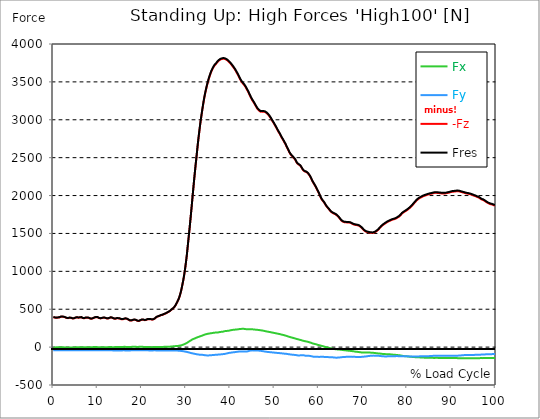
| Category |  Fx |  Fy |  -Fz |  Fres |
|---|---|---|---|---|
| 0.0 | -3.772 | -42.197 | 394.837 | 397.317 |
| 0.167348456675344 | -4.09 | -42.43 | 393.46 | 395.961 |
| 0.334696913350688 | -4.387 | -42.514 | 389.603 | 392.146 |
| 0.5020453700260321 | -3.942 | -42.154 | 386.911 | 389.433 |
| 0.669393826701376 | -3.264 | -41.688 | 386.636 | 389.094 |
| 0.83674228337672 | -2.798 | -41.243 | 388.564 | 390.959 |
| 1.0040907400520642 | -2.904 | -40.904 | 389.687 | 392.019 |
| 1.1621420602454444 | -2.84 | -40.459 | 389.009 | 391.277 |
| 1.3294905169207885 | -2.289 | -40.141 | 391.446 | 393.651 |
| 1.4968389735961325 | -1.886 | -40.141 | 395.791 | 397.932 |
| 1.6641874302714765 | -1.632 | -40.353 | 400.517 | 402.637 |
| 1.8315358869468206 | -1.95 | -40.48 | 402.043 | 404.184 |
| 1.9988843436221646 | -2.374 | -40.649 | 401.513 | 403.696 |
| 2.1662328002975086 | -2.395 | -40.734 | 399.966 | 402.149 |
| 2.333581256972853 | -2.522 | -40.861 | 399.585 | 401.81 |
| 2.5009297136481967 | -3.2 | -40.967 | 397.614 | 399.86 |
| 2.6682781703235405 | -4.281 | -41.031 | 392.994 | 395.304 |
| 2.8356266269988843 | -5.129 | -40.988 | 387.95 | 390.302 |
| 3.002975083674229 | -5.532 | -41.01 | 384.262 | 386.657 |
| 3.1703235403495724 | -5.341 | -40.904 | 382.227 | 384.664 |
| 3.337671997024917 | -5.171 | -40.84 | 382.164 | 384.601 |
| 3.4957233172182973 | -5.171 | -40.988 | 385.025 | 387.462 |
| 3.663071773893641 | -5.214 | -41.2 | 387.61 | 390.048 |
| 3.8304202305689854 | -5.616 | -41.349 | 387.738 | 390.175 |
| 3.997768687244329 | -6.019 | -41.349 | 385.427 | 387.886 |
| 4.165117143919673 | -6.443 | -41.306 | 381.697 | 384.156 |
| 4.332465600595017 | -6.316 | -41.031 | 378.497 | 380.956 |
| 4.499814057270361 | -5.722 | -40.565 | 377.247 | 379.642 |
| 4.667162513945706 | -4.535 | -40.077 | 379.514 | 381.782 |
| 4.834510970621049 | -3.221 | -39.844 | 383.796 | 385.979 |
| 5.001859427296393 | -2.649 | -40.162 | 388.501 | 390.683 |
| 5.169207883971737 | -2.437 | -40.416 | 392.019 | 394.202 |
| 5.336556340647081 | -2.67 | -40.565 | 392.888 | 395.092 |
| 5.503904797322425 | -2.861 | -40.713 | 391.15 | 393.396 |
| 5.671253253997769 | -2.904 | -40.861 | 388.289 | 390.578 |
| 5.82930457419115 | -2.183 | -40.734 | 387.907 | 390.175 |
| 5.996653030866494 | -1.335 | -40.522 | 391.552 | 393.778 |
| 6.164001487541838 | -0.911 | -40.416 | 394.943 | 397.148 |
| 6.331349944217181 | -1.526 | -40.48 | 393.947 | 396.151 |
| 6.498698400892526 | -2.374 | -40.586 | 388.967 | 391.235 |
| 6.66604685756787 | -2.607 | -40.48 | 382.927 | 385.237 |
| 6.833395314243213 | -2.035 | -40.183 | 380.256 | 382.566 |
| 7.000743770918558 | -1.166 | -39.844 | 380.85 | 383.096 |
| 7.168092227593902 | -0.339 | -39.823 | 385.237 | 387.441 |
| 7.335440684269246 | -0.276 | -40.077 | 389.073 | 391.298 |
| 7.50278914094459 | -0.424 | -40.162 | 390.789 | 393.015 |
| 7.6701375976199335 | -1.314 | -40.395 | 389.009 | 391.298 |
| 7.837486054295278 | -1.823 | -40.607 | 386.975 | 389.327 |
| 7.995537374488658 | -2.31 | -40.84 | 385.894 | 388.31 |
| 8.162885831164003 | -2.437 | -40.967 | 380.32 | 382.757 |
| 8.330234287839346 | -2.374 | -41.01 | 376.335 | 378.815 |
| 8.49758274451469 | -1.801 | -40.988 | 374.873 | 377.331 |
| 8.664931201190035 | -1.06 | -40.925 | 375.191 | 377.607 |
| 8.832279657865378 | -0.53 | -41.01 | 378.222 | 380.595 |
| 8.999628114540721 | 0 | -40.967 | 381.231 | 383.541 |
| 9.166976571216066 | 0.742 | -40.946 | 385.788 | 388.055 |
| 9.334325027891412 | 1.272 | -40.904 | 390.938 | 393.184 |
| 9.501673484566755 | 1.229 | -41.01 | 393.714 | 395.94 |
| 9.669021941242098 | 1.081 | -40.904 | 395.961 | 398.165 |
| 9.836370397917442 | 0.487 | -41.094 | 396.3 | 398.546 |
| 10.003718854592787 | -0.699 | -41.518 | 394.053 | 396.385 |
| 10.17106731126813 | -2.098 | -41.921 | 388.628 | 391.065 |
| 10.329118631461512 | -2.861 | -41.963 | 382.905 | 385.406 |
| 10.496467088136853 | -2.861 | -41.836 | 380.129 | 382.672 |
| 10.663815544812199 | -2.628 | -41.73 | 379.091 | 381.634 |
| 10.831164001487544 | -2.268 | -41.518 | 380.659 | 383.181 |
| 10.998512458162887 | -1.929 | -41.518 | 383.711 | 386.212 |
| 11.16586091483823 | -1.695 | -41.645 | 387.377 | 389.878 |
| 11.333209371513574 | -1.907 | -41.667 | 388.161 | 390.683 |
| 11.50055782818892 | -2.077 | -41.497 | 386.996 | 389.497 |
| 11.667906284864264 | -2.247 | -41.518 | 386.699 | 389.179 |
| 11.835254741539607 | -2.543 | -41.561 | 383.753 | 386.254 |
| 12.00260319821495 | -2.522 | -41.773 | 379.514 | 382.079 |
| 12.169951654890292 | -2.119 | -41.773 | 377.183 | 379.748 |
| 12.337300111565641 | -1.166 | -41.667 | 377.056 | 379.578 |
| 12.504648568240984 | -0.466 | -41.476 | 379.663 | 382.142 |
| 12.662699888434362 | 0.318 | -41.497 | 384.325 | 386.741 |
| 12.830048345109708 | 0.636 | -41.857 | 389.285 | 391.701 |
| 12.997396801785053 | 0.551 | -42.218 | 391.976 | 394.414 |
| 13.164745258460396 | 0.212 | -42.451 | 390.132 | 392.612 |
| 13.33209371513574 | -0.445 | -42.981 | 386.275 | 388.882 |
| 13.499442171811083 | -0.911 | -43.489 | 381.146 | 383.88 |
| 13.666790628486426 | -0.763 | -43.68 | 376.78 | 379.578 |
| 13.834139085161771 | -0.276 | -43.659 | 374.576 | 377.395 |
| 14.001487541837117 | 0.254 | -43.595 | 374.492 | 377.31 |
| 14.16883599851246 | 0.657 | -43.595 | 376.717 | 379.514 |
| 14.336184455187803 | 0.848 | -43.744 | 379.938 | 382.736 |
| 14.503532911863147 | 0.615 | -43.807 | 380.998 | 383.817 |
| 14.670881368538492 | 0.297 | -43.828 | 379.705 | 382.545 |
| 14.828932688731873 | 0.106 | -44.062 | 379.069 | 381.952 |
| 14.996281145407215 | -0.042 | -43.913 | 376.738 | 379.599 |
| 15.163629602082558 | -0.148 | -43.892 | 372.605 | 375.466 |
| 15.330978058757903 | 0.424 | -43.786 | 368.303 | 371.185 |
| 15.498326515433247 | 0.975 | -43.405 | 366.141 | 368.939 |
| 15.665674972108594 | 1.886 | -43.108 | 366.756 | 369.49 |
| 15.833023428783937 | 2.692 | -42.748 | 369.469 | 372.097 |
| 16.00037188545928 | 3.645 | -42.769 | 373.432 | 376.017 |
| 16.167720342134626 | 3.561 | -43.277 | 376.653 | 379.26 |
| 16.335068798809967 | 3.031 | -43.744 | 376.992 | 379.663 |
| 16.502417255485312 | 2.268 | -44.252 | 374.407 | 377.141 |
| 16.669765712160658 | 1.95 | -44.634 | 372.817 | 375.594 |
| 16.837114168836 | 1.229 | -44.761 | 367.582 | 370.444 |
| 17.004462625511344 | 0.487 | -44.719 | 360.885 | 363.81 |
| 17.16251394570472 | 0.318 | -44.401 | 354.527 | 357.494 |
| 17.32986240238007 | 0.763 | -43.892 | 350.31 | 353.234 |
| 17.497210859055414 | 1.886 | -43.087 | 348.275 | 351.115 |
| 17.664559315730756 | 3.073 | -42.324 | 350.161 | 352.874 |
| 17.8319077724061 | 4.324 | -41.709 | 354.315 | 356.922 |
| 17.999256229081443 | 5.447 | -41.37 | 358.702 | 361.246 |
| 18.166604685756788 | 5.489 | -41.497 | 361.733 | 364.255 |
| 18.333953142432133 | 5.171 | -41.603 | 362.538 | 365.082 |
| 18.501301599107478 | 4.557 | -41.73 | 361.415 | 363.958 |
| 18.668650055782823 | 3.603 | -41.879 | 357.579 | 360.186 |
| 18.835998512458165 | 2.861 | -41.794 | 352.429 | 355.057 |
| 19.00334696913351 | 2.289 | -41.54 | 347.173 | 349.801 |
| 19.170695425808855 | 2.522 | -41.137 | 344.291 | 346.897 |
| 19.338043882484197 | 3.349 | -40.565 | 344.46 | 346.982 |
| 19.496095202677576 | 4.154 | -40.204 | 348.402 | 350.882 |
| 19.66344365935292 | 4.896 | -40.014 | 353.552 | 355.968 |
| 19.830792116028263 | 5.044 | -40.416 | 359.402 | 361.839 |
| 19.998140572703612 | 4.747 | -40.692 | 362.454 | 364.912 |
| 20.165489029378953 | 3.942 | -41.052 | 363.725 | 366.205 |
| 20.3328374860543 | 3.031 | -41.37 | 361.712 | 364.255 |
| 20.500185942729644 | 2.374 | -41.391 | 358.512 | 361.055 |
| 20.667534399404985 | 1.717 | -41.412 | 355.29 | 357.876 |
| 20.83488285608033 | 1.886 | -41.391 | 356.307 | 358.872 |
| 21.002231312755672 | 2.056 | -41.603 | 359.783 | 362.348 |
| 21.16957976943102 | 2.119 | -42.091 | 364.128 | 366.713 |
| 21.336928226106362 | 1.929 | -42.684 | 368.027 | 370.656 |
| 21.504276682781704 | 1.378 | -43.193 | 369.808 | 372.499 |
| 21.67162513945705 | 0.572 | -43.468 | 369.236 | 371.991 |
| 21.82967645965043 | 0.064 | -43.722 | 368.706 | 371.482 |
| 21.997024916325774 | -0.403 | -43.934 | 367.561 | 370.359 |
| 22.16437337300112 | -0.784 | -43.892 | 364.7 | 367.54 |
| 22.33172182967646 | -0.911 | -43.765 | 362.92 | 365.739 |
| 22.499070286351806 | -0.064 | -43.32 | 364.848 | 367.582 |
| 22.666418743027148 | 0.805 | -42.981 | 367.688 | 370.359 |
| 22.833767199702496 | 1.547 | -42.832 | 372.16 | 374.788 |
| 23.00111565637784 | 2.225 | -42.875 | 379.472 | 382.036 |
| 23.168464113053183 | 2.628 | -43.32 | 389.052 | 391.616 |
| 23.335812569728528 | 2.416 | -43.744 | 397.042 | 399.627 |
| 23.50316102640387 | 2.31 | -43.956 | 402.679 | 405.244 |
| 23.670509483079215 | 1.801 | -44.083 | 405.371 | 407.956 |
| 23.83785793975456 | 1.102 | -44.21 | 407.045 | 409.673 |
| 23.995909259947936 | 1.187 | -44.379 | 411.835 | 414.442 |
| 24.163257716623285 | 1.166 | -44.803 | 418.384 | 421.033 |
| 24.330606173298627 | 1.505 | -44.74 | 421.881 | 424.509 |
| 24.49795462997397 | 1.907 | -44.591 | 423.428 | 426.034 |
| 24.665303086649313 | 2.31 | -44.443 | 425.017 | 427.603 |
| 24.83265154332466 | 2.776 | -44.549 | 429.701 | 432.308 |
| 25.0 | 3.37 | -44.528 | 435.021 | 437.585 |
| 25.167348456675345 | 3.815 | -44.401 | 439.429 | 441.972 |
| 25.334696913350694 | 4.09 | -44.316 | 442.587 | 445.109 |
| 25.502045370026035 | 4.048 | -44.591 | 449.538 | 452.06 |
| 25.669393826701377 | 4.069 | -44.379 | 452.95 | 455.43 |
| 25.836742283376722 | 4.281 | -44.231 | 457.592 | 460.05 |
| 26.004090740052067 | 4.684 | -44.189 | 463.335 | 465.794 |
| 26.17143919672741 | 5.065 | -44.168 | 469.121 | 471.58 |
| 26.329490516920792 | 5.765 | -44.146 | 475.564 | 478.022 |
| 26.49683897359613 | 6.676 | -44.083 | 483.109 | 485.589 |
| 26.66418743027148 | 7.693 | -44.062 | 492.243 | 494.723 |
| 26.831535886946828 | 8.753 | -44.019 | 500.127 | 502.607 |
| 26.998884343622166 | 9.77 | -43.998 | 507.905 | 510.406 |
| 27.166232800297514 | 10.809 | -44.146 | 516.87 | 519.392 |
| 27.333581256972852 | 11.826 | -44.401 | 526.408 | 528.951 |
| 27.5009297136482 | 12.843 | -44.676 | 536.347 | 538.912 |
| 27.668278170323543 | 13.606 | -45.142 | 555.188 | 557.774 |
| 27.835626626998888 | 13.712 | -45.63 | 573.86 | 576.467 |
| 28.002975083674233 | 14.496 | -46.011 | 592.701 | 595.329 |
| 28.170323540349575 | 15.662 | -46.414 | 614.192 | 616.798 |
| 28.33767199702492 | 16.828 | -47.135 | 634.008 | 636.657 |
| 28.50502045370026 | 18.438 | -48.237 | 661.877 | 664.59 |
| 28.663071773893645 | 20.833 | -48.767 | 693.392 | 696.169 |
| 28.830420230568986 | 22.783 | -50.187 | 729.612 | 732.473 |
| 28.99776868724433 | 25.199 | -51.628 | 772.127 | 775.051 |
| 29.165117143919673 | 28.018 | -52.942 | 819.749 | 822.779 |
| 29.33246560059502 | 32.087 | -53.641 | 868.664 | 871.821 |
| 29.499814057270367 | 35.457 | -55.697 | 922.368 | 925.674 |
| 29.66716251394571 | 39.59 | -57.435 | 984.021 | 987.496 |
| 29.834510970621054 | 44.337 | -59.067 | 1051.946 | 1055.57 |
| 30.00185942729639 | 49.148 | -61.165 | 1127.671 | 1131.443 |
| 30.169207883971744 | 54.616 | -62.882 | 1206.638 | 1210.602 |
| 30.33655634064708 | 60.593 | -65.955 | 1300.993 | 1305.189 |
| 30.50390479732243 | 67.883 | -67.904 | 1394.902 | 1399.437 |
| 30.671253253997772 | 74.029 | -70.32 | 1488.726 | 1493.6 |
| 30.829304574191156 | 80.451 | -73.076 | 1583.928 | 1589.12 |
| 30.996653030866494 | 85.58 | -76.551 | 1684.64 | 1690.108 |
| 31.164001487541842 | 92.531 | -78.501 | 1787.026 | 1792.791 |
| 31.331349944217187 | 98.275 | -80.875 | 1892.104 | 1898.081 |
| 31.498698400892525 | 103.255 | -83.291 | 2000.531 | 2006.656 |
| 31.666046857567874 | 107.558 | -85.241 | 2104.549 | 2110.759 |
| 31.833395314243212 | 111.648 | -87.042 | 2206.83 | 2213.124 |
| 32.00074377091856 | 114.912 | -89.14 | 2304.85 | 2311.23 |
| 32.1680922275939 | 119.426 | -91.366 | 2402.129 | 2408.636 |
| 32.33544068426925 | 124.237 | -93.104 | 2489.214 | 2495.89 |
| 32.50278914094459 | 127.967 | -94.82 | 2585.051 | 2591.791 |
| 32.670137597619934 | 131.422 | -96.749 | 2678.409 | 2685.191 |
| 32.83748605429528 | 134.622 | -98.508 | 2763.544 | 2770.432 |
| 33.004834510970625 | 138.479 | -99.674 | 2844.016 | 2851.01 |
| 33.162885831164004 | 142.421 | -100.839 | 2923.429 | 2930.508 |
| 33.33023428783935 | 145.41 | -101.263 | 2995.593 | 3002.672 |
| 33.497582744514695 | 148.271 | -101.602 | 3060.552 | 3067.673 |
| 33.664931201190036 | 152.043 | -101.56 | 3126.04 | 3133.246 |
| 33.83227965786538 | 156.091 | -102.217 | 3188.837 | 3196.191 |
| 33.99962811454073 | 160.393 | -104.061 | 3247.586 | 3255.152 |
| 34.16697657121607 | 164.59 | -106.392 | 3302.244 | 3310.043 |
| 34.33432502789141 | 167.875 | -107.642 | 3349.654 | 3357.602 |
| 34.50167348456676 | 170.46 | -108.787 | 3394.352 | 3402.405 |
| 34.6690219412421 | 172.453 | -109.338 | 3436.23 | 3444.326 |
| 34.83637039791744 | 174.466 | -109.508 | 3475.015 | 3483.153 |
| 35.00371885459279 | 176.861 | -109.592 | 3511.425 | 3519.606 |
| 35.17106731126814 | 178.556 | -109.211 | 3544.593 | 3552.795 |
| 35.338415767943474 | 180.231 | -108.639 | 3575.409 | 3583.632 |
| 35.49646708813686 | 181.672 | -107.748 | 3603.512 | 3611.756 |
| 35.6638155448122 | 183.028 | -106.752 | 3629.453 | 3637.676 |
| 35.831164001487544 | 184.406 | -105.693 | 3652.363 | 3660.586 |
| 35.998512458162885 | 186.292 | -105.036 | 3672.476 | 3680.741 |
| 36.165860914838234 | 188.475 | -104.4 | 3690.787 | 3699.116 |
| 36.333209371513576 | 190.361 | -103.467 | 3707.191 | 3715.541 |
| 36.50055782818892 | 192.057 | -102.471 | 3720.84 | 3729.253 |
| 36.667906284864266 | 191.463 | -101.136 | 3730.144 | 3738.451 |
| 36.83525474153961 | 190.912 | -100.479 | 3741.461 | 3749.663 |
| 37.002603198214956 | 191.421 | -100.246 | 3755.957 | 3764.117 |
| 37.1699516548903 | 192.862 | -99.313 | 3767.593 | 3775.773 |
| 37.337300111565646 | 194.579 | -98.444 | 3777.003 | 3785.226 |
| 37.50464856824098 | 196.55 | -97.512 | 3784.463 | 3792.707 |
| 37.66269988843437 | 199.241 | -97.088 | 3791.478 | 3799.828 |
| 37.83004834510971 | 201.212 | -96.219 | 3796.734 | 3805.127 |
| 37.99739680178505 | 201.869 | -94.714 | 3800.824 | 3809.196 |
| 38.16474525846039 | 202.314 | -93.506 | 3803.834 | 3812.163 |
| 38.33209371513574 | 203.671 | -92.765 | 3805.678 | 3814.007 |
| 38.49944217181109 | 207.104 | -91.726 | 3806.398 | 3814.833 |
| 38.666790628486424 | 209.457 | -90.539 | 3804.872 | 3813.392 |
| 38.83413908516178 | 211.428 | -88.632 | 3801.672 | 3810.234 |
| 39.001487541837115 | 212.911 | -86.449 | 3796.967 | 3805.551 |
| 39.16883599851246 | 213.717 | -84.012 | 3790.779 | 3799.341 |
| 39.336184455187805 | 214.374 | -81.913 | 3784.209 | 3792.771 |
| 39.503532911863154 | 214.882 | -78.607 | 3775.943 | 3784.463 |
| 39.670881368538495 | 216.896 | -76.721 | 3766.681 | 3775.244 |
| 39.83822982521384 | 219.333 | -76.064 | 3757.377 | 3766.046 |
| 39.996281145407224 | 221.41 | -74.623 | 3746.993 | 3755.745 |
| 40.163629602082565 | 223.529 | -72.525 | 3734.615 | 3743.453 |
| 40.33097805875791 | 225.373 | -71.083 | 3722.26 | 3731.182 |
| 40.498326515433256 | 227.111 | -69.812 | 3710.01 | 3718.996 |
| 40.6656749721086 | 228.277 | -68.795 | 3696.53 | 3705.559 |
| 40.83302342878393 | 229.209 | -67.883 | 3682.521 | 3691.614 |
| 41.00037188545929 | 230.142 | -66.824 | 3668.258 | 3677.393 |
| 41.16772034213463 | 231.138 | -65.064 | 3652.49 | 3661.688 |
| 41.33506879880997 | 232.155 | -63.348 | 3635.599 | 3644.882 |
| 41.50241725548531 | 233.066 | -62.246 | 3618.347 | 3627.736 |
| 41.66976571216066 | 234.147 | -61.186 | 3601.011 | 3610.484 |
| 41.837114168836 | 235.228 | -59.872 | 3583.017 | 3592.576 |
| 42.004462625511344 | 237.432 | -58.261 | 3562.014 | 3571.7 |
| 42.17181108218669 | 238.662 | -57.371 | 3542.622 | 3552.414 |
| 42.32986240238007 | 239.509 | -57.202 | 3523.675 | 3533.551 |
| 42.497210859055414 | 240.23 | -57.032 | 3506 | 3515.918 |
| 42.66455931573076 | 241.247 | -57.435 | 3493.601 | 3503.605 |
| 42.831907772406105 | 242.413 | -58.049 | 3480.398 | 3490.507 |
| 42.999256229081446 | 242.053 | -58.537 | 3469.335 | 3479.423 |
| 43.16660468575679 | 239.891 | -58.622 | 3458.038 | 3467.936 |
| 43.33395314243214 | 238.089 | -58.812 | 3445.534 | 3455.304 |
| 43.50130159910748 | 237.814 | -59.385 | 3427.838 | 3437.629 |
| 43.66865005578282 | 236.648 | -58.643 | 3409.823 | 3419.551 |
| 43.83599851245817 | 235.631 | -56.693 | 3391.681 | 3401.345 |
| 44.00334696913351 | 235.016 | -54.213 | 3373.857 | 3383.458 |
| 44.17069542580886 | 235.207 | -51.373 | 3353.808 | 3363.409 |
| 44.3380438824842 | 235.843 | -48.512 | 3333.06 | 3342.682 |
| 44.49609520267758 | 235.949 | -46.202 | 3312.205 | 3321.827 |
| 44.66344365935292 | 235.207 | -44.74 | 3291.181 | 3300.782 |
| 44.83079211602827 | 235.059 | -43.638 | 3272.764 | 3282.386 |
| 44.99814057270361 | 235.037 | -42.896 | 3255.385 | 3265.049 |
| 45.16548902937895 | 234.126 | -43.913 | 3241.63 | 3251.273 |
| 45.332837486054295 | 232.706 | -45.079 | 3228.639 | 3238.218 |
| 45.500185942729644 | 231.307 | -45.821 | 3209.204 | 3218.741 |
| 45.66753439940499 | 230.566 | -44.57 | 3191.211 | 3200.705 |
| 45.83488285608033 | 229.781 | -43.998 | 3174.107 | 3183.602 |
| 46.00223131275568 | 228.891 | -43.85 | 3157.534 | 3167.007 |
| 46.16957976943102 | 227.768 | -44.655 | 3142.169 | 3151.621 |
| 46.336928226106366 | 226.56 | -45.693 | 3129.834 | 3139.244 |
| 46.50427668278171 | 225.204 | -46.626 | 3121.505 | 3130.851 |
| 46.671625139457056 | 223.868 | -47.41 | 3113.896 | 3123.2 |
| 46.829676459650436 | 222.533 | -48.321 | 3107.369 | 3116.588 |
| 46.99702491632577 | 221.198 | -50.102 | 3107.284 | 3116.439 |
| 47.16437337300112 | 219.693 | -51.818 | 3107.665 | 3116.757 |
| 47.33172182967646 | 218.019 | -53.493 | 3108.555 | 3117.542 |
| 47.49907028635181 | 216.069 | -55.061 | 3106.394 | 3115.295 |
| 47.66641874302716 | 213.929 | -56.693 | 3104.02 | 3112.837 |
| 47.83376719970249 | 211.788 | -58.473 | 3103.321 | 3112.031 |
| 48.001115656377834 | 209.605 | -59.978 | 3098.128 | 3106.754 |
| 48.16846411305319 | 207.401 | -61.334 | 3090.456 | 3098.997 |
| 48.33581256972853 | 205.197 | -62.691 | 3082.784 | 3091.24 |
| 48.50316102640387 | 203.311 | -63.623 | 3072.357 | 3080.771 |
| 48.67050948307921 | 201.53 | -64.471 | 3061.272 | 3069.644 |
| 48.837857939754564 | 199.898 | -65.7 | 3049.107 | 3057.458 |
| 49.005206396429905 | 198.372 | -67.163 | 3036.412 | 3044.741 |
| 49.163257716623285 | 196.232 | -68.604 | 3020.347 | 3028.677 |
| 49.33060617329863 | 194.07 | -69.049 | 3001.867 | 3010.09 |
| 49.49795462997397 | 192.226 | -69.452 | 2985.865 | 2994.004 |
| 49.66530308664932 | 190.255 | -70.469 | 2970.479 | 2978.575 |
| 49.832651543324666 | 187.966 | -72.058 | 2954.923 | 2962.955 |
| 50.0 | 186.228 | -72.991 | 2937.48 | 2945.449 |
| 50.16734845667534 | 184.427 | -74.008 | 2920.356 | 2928.282 |
| 50.33469691335069 | 182.456 | -75.153 | 2903.486 | 2911.391 |
| 50.50204537002604 | 180.188 | -76.128 | 2884.963 | 2892.762 |
| 50.66939382670139 | 178.069 | -76.848 | 2866.566 | 2874.26 |
| 50.836742283376715 | 175.822 | -78.099 | 2849.018 | 2856.669 |
| 51.00409074005207 | 173.936 | -78.48 | 2831.703 | 2839.311 |
| 51.17143919672741 | 171.838 | -79.349 | 2816.338 | 2823.882 |
| 51.32949051692079 | 169.507 | -80.324 | 2796.861 | 2804.321 |
| 51.496838973596134 | 166.773 | -81.574 | 2778.253 | 2785.586 |
| 51.66418743027148 | 164.187 | -82.57 | 2760.831 | 2768.058 |
| 51.831535886946824 | 161.517 | -83.884 | 2744.512 | 2751.655 |
| 51.99888434362217 | 159.864 | -84.351 | 2728.278 | 2735.378 |
| 52.16623280029752 | 157.511 | -85.728 | 2710.772 | 2717.787 |
| 52.33358125697285 | 154.629 | -87.53 | 2692.694 | 2699.645 |
| 52.5009297136482 | 152.001 | -87.848 | 2675.188 | 2682.033 |
| 52.668278170323546 | 148.843 | -88.717 | 2653.952 | 2660.67 |
| 52.835626626998895 | 145.643 | -90.37 | 2634.009 | 2640.642 |
| 53.00297508367424 | 142.379 | -91.832 | 2614.617 | 2621.123 |
| 53.17032354034958 | 139.157 | -93.082 | 2594.567 | 2600.947 |
| 53.33767199702492 | 135.512 | -94.672 | 2572.632 | 2578.842 |
| 53.50502045370027 | 132.736 | -96.05 | 2556.207 | 2562.353 |
| 53.663071773893655 | 130.087 | -97.406 | 2541.138 | 2547.242 |
| 53.83042023056899 | 127.31 | -98.762 | 2531.495 | 2537.556 |
| 53.99776868724433 | 124.809 | -99.928 | 2520.517 | 2526.557 |
| 54.16511714391967 | 122.224 | -101.581 | 2508.203 | 2514.286 |
| 54.33246560059503 | 119.469 | -102.238 | 2498.221 | 2504.24 |
| 54.49981405727037 | 116.735 | -102.492 | 2487.518 | 2493.452 |
| 54.667162513945705 | 114.022 | -102.874 | 2475.268 | 2481.139 |
| 54.834510970621054 | 111.012 | -103.849 | 2456.936 | 2462.701 |
| 55.0018594272964 | 107.685 | -106.519 | 2437.395 | 2443.075 |
| 55.169207883971744 | 104.93 | -108.787 | 2423.323 | 2429.045 |
| 55.336556340647086 | 102.747 | -110.652 | 2414.252 | 2420.017 |
| 55.50390479732243 | 99.843 | -110.694 | 2408.381 | 2414.061 |
| 55.671253253997776 | 97.448 | -109.889 | 2401.769 | 2407.343 |
| 55.83860171067312 | 95.456 | -108.49 | 2394.563 | 2400.031 |
| 55.9966530308665 | 92.574 | -106.88 | 2380.999 | 2386.319 |
| 56.16400148754184 | 89.395 | -106.286 | 2363.811 | 2369.025 |
| 56.33134994421718 | 86.131 | -105.777 | 2348.085 | 2353.172 |
| 56.498698400892536 | 83.418 | -106.646 | 2333.758 | 2338.866 |
| 56.66604685756788 | 80.79 | -108.66 | 2323.31 | 2328.481 |
| 56.83339531424321 | 78.48 | -111.839 | 2318.457 | 2323.734 |
| 57.00074377091856 | 76.785 | -113.683 | 2316.168 | 2321.53 |
| 57.16809222759391 | 74.983 | -114.001 | 2311.908 | 2317.249 |
| 57.33544068426925 | 72.991 | -113.216 | 2305.423 | 2310.7 |
| 57.5027891409446 | 70.469 | -113.216 | 2297.708 | 2302.964 |
| 57.670137597619934 | 67.82 | -113.428 | 2289.082 | 2294.381 |
| 57.83748605429528 | 64.916 | -114.615 | 2273.314 | 2278.613 |
| 58.004834510970625 | 62.013 | -116.501 | 2257.949 | 2263.332 |
| 58.16288583116401 | 58.834 | -118.239 | 2240.528 | 2245.953 |
| 58.330234287839346 | 55.209 | -119.914 | 2219.525 | 2224.95 |
| 58.497582744514695 | 51.289 | -122.393 | 2198.501 | 2203.947 |
| 58.66493120119004 | 47.643 | -125.191 | 2179.108 | 2184.555 |
| 58.832279657865385 | 45.503 | -126.971 | 2163.446 | 2168.936 |
| 58.999628114540734 | 43.087 | -126.971 | 2147.043 | 2152.532 |
| 59.16697657121607 | 40.649 | -126.971 | 2130.66 | 2136.128 |
| 59.33432502789142 | 38.488 | -126.335 | 2112.412 | 2117.795 |
| 59.50167348456676 | 35.478 | -126.293 | 2092.808 | 2098.085 |
| 59.66902194124211 | 32.002 | -127.501 | 2073.077 | 2078.375 |
| 59.83637039791745 | 29.417 | -128.794 | 2055.931 | 2061.314 |
| 60.00371885459278 | 26.831 | -129.133 | 2034.907 | 2040.29 |
| 60.17106731126813 | 24.903 | -128.879 | 2013.671 | 2019.033 |
| 60.33841576794349 | 21.575 | -128.773 | 1990.125 | 1995.466 |
| 60.49646708813685 | 18.841 | -127.946 | 1969.334 | 1974.632 |
| 60.6638155448122 | 16.446 | -127.098 | 1950.726 | 1956.003 |
| 60.831164001487544 | 14.56 | -126.335 | 1937.416 | 1942.651 |
| 60.99851245816289 | 11.508 | -127.416 | 1925.166 | 1930.401 |
| 61.16586091483824 | 8.244 | -128.879 | 1913.128 | 1918.384 |
| 61.333209371513576 | 4.62 | -130.362 | 1898.462 | 1903.74 |
| 61.50055782818892 | 2.119 | -131.125 | 1881.401 | 1886.721 |
| 61.667906284864266 | -0.827 | -131.231 | 1864.998 | 1870.317 |
| 61.835254741539615 | -2.988 | -131.189 | 1851.921 | 1857.241 |
| 62.002603198214956 | -4.896 | -131.401 | 1840.477 | 1845.839 |
| 62.16995165489029 | -7.757 | -131.952 | 1828.99 | 1834.373 |
| 62.33730011156564 | -10.194 | -132.566 | 1818.181 | 1823.628 |
| 62.504648568240995 | -12.017 | -132.821 | 1804.808 | 1810.36 |
| 62.67199702491633 | -14.263 | -132.587 | 1791.922 | 1797.475 |
| 62.83004834510971 | -16.51 | -132.63 | 1783.678 | 1789.273 |
| 62.99739680178505 | -18.672 | -133.647 | 1777.171 | 1782.851 |
| 63.1647452584604 | -20.791 | -134.855 | 1770.601 | 1776.366 |
| 63.33209371513575 | -22.868 | -136 | 1765.388 | 1771.279 |
| 63.4994421718111 | -24.924 | -137.144 | 1760.471 | 1766.468 |
| 63.666790628486424 | -26.725 | -138.225 | 1756.084 | 1762.187 |
| 63.83413908516177 | -27.976 | -139.115 | 1751.696 | 1757.906 |
| 64.00148754183712 | -29.141 | -139.666 | 1744.003 | 1750.276 |
| 64.16883599851248 | -30.18 | -139.263 | 1734.572 | 1740.866 |
| 64.3361844551878 | -30.879 | -138.288 | 1726.285 | 1732.559 |
| 64.50353291186315 | -31.494 | -137.356 | 1715.519 | 1721.771 |
| 64.6708813685385 | -32.193 | -136.487 | 1702.972 | 1709.182 |
| 64.83822982521384 | -33.74 | -135.745 | 1690.934 | 1697.123 |
| 65.00557828188919 | -35.118 | -134.643 | 1678.239 | 1684.385 |
| 65.16362960208257 | -36.05 | -133.054 | 1667.918 | 1673.979 |
| 65.3309780587579 | -37.492 | -132.015 | 1660.288 | 1666.307 |
| 65.49832651543326 | -38.975 | -130.807 | 1654.842 | 1660.797 |
| 65.6656749721086 | -40.098 | -130.002 | 1650.836 | 1656.77 |
| 65.83302342878395 | -41.01 | -129.472 | 1648.102 | 1654.015 |
| 66.00037188545929 | -42.069 | -129.048 | 1646.957 | 1652.849 |
| 66.16772034213463 | -43.574 | -128.539 | 1646.957 | 1652.849 |
| 66.33506879880998 | -44.931 | -128.645 | 1645.559 | 1651.472 |
| 66.50241725548531 | -45.799 | -128.476 | 1644.796 | 1650.709 |
| 66.66976571216065 | -46.796 | -128.179 | 1644.944 | 1650.857 |
| 66.83711416883601 | -47.707 | -127.946 | 1644.796 | 1650.709 |
| 67.00446262551135 | -48.533 | -127.882 | 1643.927 | 1649.861 |
| 67.1718110821867 | -49.572 | -128.052 | 1641.129 | 1647.106 |
| 67.32986240238007 | -50.801 | -128.285 | 1637.547 | 1643.609 |
| 67.49721085905541 | -52.518 | -128.518 | 1630.935 | 1637.081 |
| 67.66455931573076 | -53.493 | -128.9 | 1624.28 | 1630.511 |
| 67.83190777240611 | -54.913 | -128.667 | 1620.084 | 1626.357 |
| 67.99925622908145 | -56.587 | -128.243 | 1617.329 | 1623.644 |
| 68.16660468575678 | -58.431 | -128.624 | 1615.04 | 1621.462 |
| 68.33395314243214 | -60.105 | -129.09 | 1612.73 | 1619.257 |
| 68.50130159910749 | -60.699 | -129.981 | 1610.398 | 1617.032 |
| 68.66865005578282 | -61.589 | -130.595 | 1608.957 | 1615.697 |
| 68.83599851245816 | -62.86 | -130.871 | 1607.898 | 1614.722 |
| 69.00334696913352 | -64.831 | -130.828 | 1604.676 | 1611.606 |
| 69.17069542580886 | -65.425 | -130.701 | 1599.229 | 1606.202 |
| 69.3380438824842 | -67.099 | -130.871 | 1592.087 | 1599.187 |
| 69.50539233915956 | -68.392 | -129.663 | 1585.284 | 1592.384 |
| 69.66344365935292 | -70.236 | -128.921 | 1578.163 | 1585.305 |
| 69.83079211602826 | -71.147 | -128.073 | 1567.524 | 1574.687 |
| 69.99814057270362 | -71.592 | -127.098 | 1556.927 | 1564.09 |
| 70.16548902937896 | -71.889 | -126.229 | 1544.995 | 1552.158 |
| 70.33283748605429 | -71.868 | -125.233 | 1535.966 | 1543.109 |
| 70.50018594272964 | -72.016 | -124.279 | 1529.502 | 1536.581 |
| 70.667534399405 | -72.313 | -123.177 | 1524.67 | 1531.706 |
| 70.83488285608033 | -71.74 | -121.609 | 1520.304 | 1527.171 |
| 71.00223131275568 | -71.507 | -120.041 | 1517.697 | 1524.437 |
| 71.16957976943102 | -71.846 | -118.303 | 1516.193 | 1522.784 |
| 71.33692822610637 | -72.228 | -116.883 | 1513.671 | 1520.177 |
| 71.50427668278171 | -72.397 | -115.95 | 1510.576 | 1517.019 |
| 71.67162513945706 | -72.567 | -115.145 | 1509.474 | 1515.854 |
| 71.8389735961324 | -72.991 | -114.17 | 1508.669 | 1514.985 |
| 71.99702491632577 | -73.754 | -113.492 | 1507.44 | 1513.734 |
| 72.16437337300113 | -74.559 | -112.962 | 1506.38 | 1512.675 |
| 72.33172182967647 | -75.259 | -112.347 | 1508.457 | 1514.73 |
| 72.49907028635181 | -76.657 | -112.496 | 1512.251 | 1518.588 |
| 72.66641874302715 | -77.908 | -112.496 | 1516.172 | 1522.551 |
| 72.8337671997025 | -78.713 | -112.051 | 1520.601 | 1526.98 |
| 73.00111565637783 | -80.26 | -112.75 | 1528.188 | 1534.652 |
| 73.16846411305319 | -81.638 | -113.344 | 1535.394 | 1541.922 |
| 73.33581256972853 | -82.91 | -113.81 | 1542.261 | 1548.895 |
| 73.50316102640387 | -83.503 | -114.594 | 1551.332 | 1558.008 |
| 73.67050948307921 | -84.308 | -115.59 | 1561.42 | 1568.181 |
| 73.83785793975457 | -85.983 | -117.18 | 1573.924 | 1580.833 |
| 74.00520639642991 | -86.343 | -118.027 | 1583.059 | 1590.01 |
| 74.16325771662328 | -87.636 | -119.129 | 1594.164 | 1601.222 |
| 74.33060617329863 | -89.225 | -120.041 | 1603.214 | 1610.398 |
| 74.49795462997398 | -90.285 | -120.613 | 1611.055 | 1618.304 |
| 74.66530308664932 | -90.772 | -121.673 | 1617.541 | 1624.874 |
| 74.83265154332466 | -91.896 | -122.499 | 1624.641 | 1632.058 |
| 75.00000000000001 | -92.383 | -122.796 | 1632.588 | 1640.048 |
| 75.16734845667534 | -92.743 | -123.898 | 1638.395 | 1645.94 |
| 75.3346969133507 | -92.976 | -123.177 | 1645.071 | 1652.574 |
| 75.50204537002605 | -92.828 | -121.906 | 1650.836 | 1658.232 |
| 75.66939382670138 | -92.913 | -121.079 | 1656.071 | 1663.425 |
| 75.83674228337672 | -93.379 | -120.889 | 1660.903 | 1668.257 |
| 76.00409074005208 | -94.206 | -121.122 | 1664.527 | 1671.945 |
| 76.17143919672742 | -95.329 | -121.334 | 1669.486 | 1676.946 |
| 76.33878765340276 | -96.601 | -121.079 | 1674.7 | 1682.181 |
| 76.49683897359614 | -97.639 | -120.592 | 1678.176 | 1685.657 |
| 76.66418743027148 | -98.953 | -119.638 | 1681.991 | 1689.493 |
| 76.83153588694682 | -99.801 | -119.341 | 1684.555 | 1692.079 |
| 76.99888434362218 | -100.585 | -119.151 | 1686.95 | 1694.516 |
| 77.16623280029752 | -101.327 | -119.023 | 1689.684 | 1697.292 |
| 77.33358125697285 | -101.984 | -119.087 | 1693.478 | 1701.128 |
| 77.5009297136482 | -102.916 | -118.96 | 1698.543 | 1706.257 |
| 77.66827817032356 | -103.976 | -118.748 | 1704.816 | 1712.552 |
| 77.83562662699889 | -105.163 | -118.96 | 1710.581 | 1718.359 |
| 78.00297508367423 | -106.286 | -119.087 | 1716.769 | 1724.632 |
| 78.17032354034959 | -107.282 | -119.723 | 1722.258 | 1730.185 |
| 78.33767199702493 | -108.427 | -119.723 | 1730.948 | 1738.917 |
| 78.50502045370027 | -109.613 | -119.786 | 1740.697 | 1748.687 |
| 78.67236891037561 | -111.881 | -120.083 | 1752.798 | 1760.894 |
| 78.83042023056899 | -114.064 | -120.104 | 1763.268 | 1771.47 |
| 78.99776868724433 | -116.205 | -120.083 | 1770.665 | 1778.951 |
| 79.16511714391969 | -118.345 | -120.465 | 1777.892 | 1786.306 |
| 79.33246560059503 | -119.045 | -120.677 | 1783.826 | 1792.261 |
| 79.49981405727036 | -120.083 | -120.677 | 1790.269 | 1798.746 |
| 79.66716251394571 | -121.164 | -120.931 | 1796.457 | 1804.998 |
| 79.83451097062107 | -121.63 | -121.482 | 1802.349 | 1810.933 |
| 80.00185942729641 | -122.499 | -121.863 | 1809.407 | 1818.054 |
| 80.16920788397174 | -123.474 | -122.245 | 1816.719 | 1825.408 |
| 80.33655634064709 | -124.428 | -122.351 | 1824.56 | 1833.292 |
| 80.50390479732243 | -125.615 | -122.732 | 1832.932 | 1841.706 |
| 80.67125325399778 | -126.907 | -123.305 | 1842.384 | 1851.243 |
| 80.83860171067312 | -127.607 | -123.898 | 1851.201 | 1860.102 |
| 80.99665303086651 | -128.582 | -123.898 | 1860.95 | 1869.872 |
| 81.16400148754184 | -129.811 | -124.174 | 1871.08 | 1880.066 |
| 81.3313499442172 | -130.489 | -124.004 | 1882.482 | 1891.468 |
| 81.49869840089255 | -131.146 | -123.22 | 1893.439 | 1902.383 |
| 81.66604685756786 | -131.909 | -122.52 | 1904.714 | 1913.595 |
| 81.83339531424322 | -132.609 | -123.283 | 1916.71 | 1925.654 |
| 82.00074377091858 | -133.308 | -123.517 | 1927.858 | 1936.823 |
| 82.16809222759392 | -133.838 | -122.902 | 1937.967 | 1946.89 |
| 82.33544068426926 | -134.431 | -122.478 | 1946.53 | 1955.452 |
| 82.50278914094459 | -134.686 | -122.436 | 1954.053 | 1962.976 |
| 82.67013759761994 | -134.876 | -122.414 | 1961.429 | 1970.33 |
| 82.83748605429528 | -135.321 | -121.863 | 1967.511 | 1976.391 |
| 83.00483451097062 | -135.851 | -121.503 | 1972.237 | 1981.118 |
| 83.17218296764597 | -136.826 | -121.757 | 1977.345 | 1986.289 |
| 83.33023428783935 | -137.928 | -122.118 | 1981.669 | 1990.718 |
| 83.4975827445147 | -138.458 | -120.931 | 1987.772 | 1996.758 |
| 83.66493120119004 | -138.119 | -120.592 | 1992.901 | 2001.845 |
| 83.83227965786537 | -138.776 | -120.719 | 1996.313 | 2005.278 |
| 83.99962811454073 | -139.433 | -120.655 | 1999.81 | 2008.818 |
| 84.16697657121607 | -139.412 | -120.867 | 2002.777 | 2011.785 |
| 84.33432502789142 | -139.645 | -120.443 | 2006.084 | 2015.07 |
| 84.50167348456677 | -140.429 | -120.38 | 2009.771 | 2018.779 |
| 84.6690219412421 | -141.044 | -120.316 | 2012.675 | 2021.703 |
| 84.83637039791745 | -141.107 | -119.977 | 2015.26 | 2024.31 |
| 85.0037188545928 | -141.001 | -119.045 | 2018.715 | 2027.701 |
| 85.17106731126813 | -140.62 | -117.837 | 2021.831 | 2030.732 |
| 85.33841576794349 | -140.599 | -117.095 | 2023.102 | 2031.961 |
| 85.50576422461883 | -141.001 | -116.735 | 2024.522 | 2033.402 |
| 85.66381554481221 | -141.616 | -116.395 | 2027.214 | 2036.115 |
| 85.83116400148755 | -142.379 | -115.124 | 2030.181 | 2039.061 |
| 85.99851245816289 | -142.252 | -114.403 | 2032.66 | 2041.498 |
| 86.16586091483823 | -142.082 | -113.725 | 2035.119 | 2043.914 |
| 86.33320937151358 | -142.146 | -113.577 | 2035.988 | 2044.804 |
| 86.50055782818893 | -142.082 | -113.556 | 2036.454 | 2045.271 |
| 86.66790628486427 | -141.531 | -113.556 | 2035.755 | 2044.529 |
| 86.83525474153961 | -141.849 | -113.428 | 2034.441 | 2043.215 |
| 87.00260319821496 | -142.23 | -113.492 | 2033.466 | 2042.261 |
| 87.16995165489031 | -142.4 | -113.661 | 2032.639 | 2041.435 |
| 87.33730011156564 | -142.57 | -113.577 | 2031.58 | 2040.396 |
| 87.504648568241 | -142.972 | -112.814 | 2030.202 | 2038.997 |
| 87.67199702491634 | -142.718 | -112.665 | 2028.74 | 2037.493 |
| 87.83004834510972 | -142.76 | -112.538 | 2027.955 | 2036.708 |
| 87.99739680178506 | -143.057 | -112.411 | 2027.807 | 2036.56 |
| 88.1647452584604 | -143.142 | -112.581 | 2027.828 | 2036.602 |
| 88.33209371513574 | -143.099 | -112.687 | 2027.659 | 2036.433 |
| 88.49944217181108 | -142.76 | -112.623 | 2027.214 | 2035.924 |
| 88.66679062848644 | -142.909 | -112.453 | 2028.57 | 2037.281 |
| 88.83413908516178 | -142.887 | -112.559 | 2030.52 | 2039.209 |
| 89.00148754183712 | -142.866 | -112.475 | 2032.809 | 2041.477 |
| 89.16883599851246 | -142.76 | -112.453 | 2035.119 | 2043.745 |
| 89.33618445518782 | -142.654 | -112.538 | 2036.878 | 2045.504 |
| 89.50353291186315 | -143.078 | -112.877 | 2039.061 | 2047.729 |
| 89.6708813685385 | -143.756 | -113.089 | 2041.329 | 2050.06 |
| 89.83822982521386 | -144.244 | -112.793 | 2045.059 | 2053.791 |
| 90.00557828188919 | -144.413 | -113.047 | 2047.729 | 2056.461 |
| 90.16362960208257 | -144.901 | -113.026 | 2049.764 | 2058.517 |
| 90.3309780587579 | -144.816 | -112.962 | 2051.035 | 2059.767 |
| 90.49832651543326 | -144.392 | -112.983 | 2051.671 | 2060.382 |
| 90.66567497210859 | -144.583 | -112.793 | 2052.201 | 2060.912 |
| 90.83302342878395 | -145.282 | -112.623 | 2054.257 | 2063.01 |
| 91.00037188545929 | -145.261 | -112.411 | 2055.698 | 2064.409 |
| 91.16772034213463 | -145.304 | -112.687 | 2056.63 | 2065.362 |
| 91.33506879880998 | -145.282 | -113.026 | 2057.478 | 2066.231 |
| 91.50241725548533 | -146.194 | -112.263 | 2057.076 | 2065.85 |
| 91.66976571216065 | -146.893 | -111.924 | 2056.567 | 2065.362 |
| 91.83711416883601 | -146.745 | -111.309 | 2054.342 | 2063.095 |
| 92.00446262551137 | -146.596 | -110.525 | 2051.586 | 2060.297 |
| 92.1718110821867 | -146.639 | -109.592 | 2048.301 | 2056.948 |
| 92.33915953886203 | -146.957 | -108.639 | 2045.398 | 2054.045 |
| 92.49721085905541 | -147.423 | -107.642 | 2042.706 | 2051.353 |
| 92.66455931573077 | -147.868 | -106.668 | 2040.015 | 2048.64 |
| 92.83190777240611 | -148.08 | -106.032 | 2037.09 | 2045.716 |
| 92.99925622908145 | -148.186 | -105.142 | 2035.14 | 2043.702 |
| 93.1666046857568 | -147.995 | -104.294 | 2031.304 | 2039.824 |
| 93.33395314243214 | -147.783 | -104.251 | 2028.422 | 2036.942 |
| 93.50130159910749 | -148.334 | -103.849 | 2027.108 | 2035.649 |
| 93.66865005578283 | -148.631 | -103.446 | 2025.794 | 2034.356 |
| 93.83599851245818 | -148.122 | -103.489 | 2023.378 | 2031.919 |
| 94.00334696913353 | -147.826 | -103.255 | 2021.619 | 2030.117 |
| 94.17069542580886 | -146.957 | -103.171 | 2019.414 | 2027.85 |
| 94.3380438824842 | -147.19 | -103.234 | 2016.447 | 2024.904 |
| 94.50539233915954 | -147.402 | -103.404 | 2012.717 | 2021.216 |
| 94.66344365935292 | -147.296 | -103.383 | 2009.284 | 2017.804 |
| 94.83079211602828 | -147.359 | -103.425 | 2005.533 | 2014.095 |
| 94.99814057270362 | -147.402 | -103.34 | 2001.972 | 2010.534 |
| 95.16548902937897 | -147.338 | -102.832 | 1997.161 | 2005.723 |
| 95.33283748605432 | -147.381 | -102.175 | 1994.321 | 2002.862 |
| 95.50018594272963 | -146.724 | -101.729 | 1991.248 | 1999.726 |
| 95.66753439940499 | -146.512 | -101.56 | 1985.992 | 1994.47 |
| 95.83488285608034 | -146.533 | -101.39 | 1980.842 | 1989.319 |
| 96.00223131275567 | -146.342 | -100.839 | 1978.193 | 1986.628 |
| 96.16957976943102 | -146.067 | -100.776 | 1974.929 | 1983.364 |
| 96.33692822610638 | -145.6 | -100.225 | 1970.648 | 1979.041 |
| 96.50427668278171 | -145.558 | -99.758 | 1961.662 | 1970.076 |
| 96.67162513945706 | -145.007 | -99.165 | 1953.672 | 1962.022 |
| 96.8389735961324 | -145.261 | -98.233 | 1948.055 | 1956.406 |
| 96.99702491632577 | -145.41 | -97.533 | 1944.029 | 1952.358 |
| 97.16437337300111 | -145.007 | -97.47 | 1941.888 | 1950.217 |
| 97.33172182967647 | -145.092 | -97.427 | 1937.437 | 1945.767 |
| 97.49907028635181 | -144.753 | -96.707 | 1930.846 | 1939.133 |
| 97.66641874302715 | -144.413 | -95.901 | 1923.513 | 1931.8 |
| 97.8337671997025 | -144.329 | -95.138 | 1916.689 | 1924.954 |
| 98.00111565637785 | -144.435 | -94.418 | 1910.31 | 1918.575 |
| 98.16846411305319 | -144.202 | -93.845 | 1904.079 | 1912.344 |
| 98.33581256972855 | -143.905 | -93.316 | 1897.89 | 1906.134 |
| 98.50316102640389 | -143.756 | -93.082 | 1894.393 | 1902.638 |
| 98.67050948307921 | -143.756 | -92.955 | 1890.642 | 1898.886 |
| 98.83785793975456 | -143.947 | -92.871 | 1886.721 | 1895.008 |
| 99.0052063964299 | -143.714 | -92.722 | 1884.496 | 1892.782 |
| 99.17255485310525 | -143.375 | -92.722 | 1882.482 | 1890.748 |
| 99.33060617329863 | -143.544 | -92.489 | 1878.222 | 1886.509 |
| 99.49795462997399 | -143.481 | -92.002 | 1874.217 | 1882.482 |
| 99.66530308664933 | -143.311 | -91.896 | 1869.703 | 1878.01 |
| 99.83265154332467 | -143.841 | -91.726 | 1866.863 | 1875.213 |
| 100.0 | -144.498 | -91.472 | 1864.976 | 1873.39 |